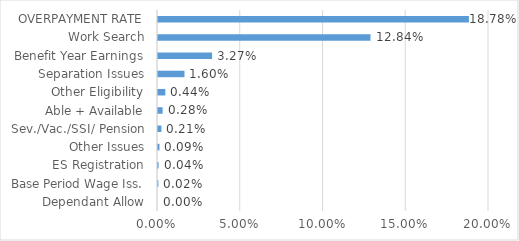
| Category | Series 0 |
|---|---|
| Dependant Allow | 0 |
| Base Period Wage Iss. | 0 |
| ES Registration | 0 |
| Other Issues | 0.001 |
| Sev./Vac./SSI/ Pension | 0.002 |
| Able + Available | 0.003 |
| Other Eligibility | 0.004 |
| Separation Issues | 0.016 |
| Benefit Year Earnings | 0.033 |
| Work Search | 0.128 |
| OVERPAYMENT RATE | 0.188 |